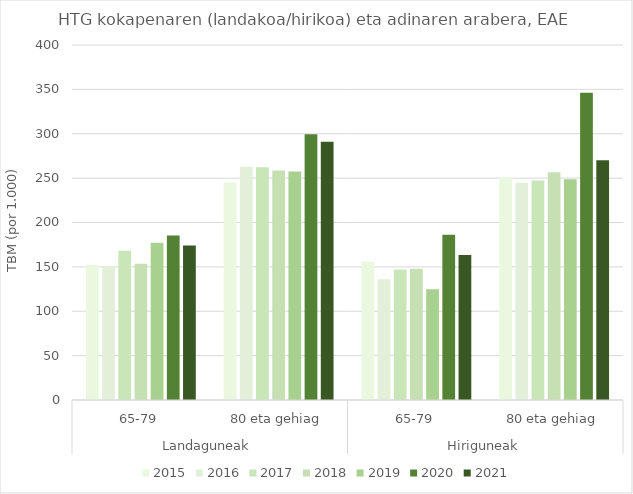
| Category | 2015 | 2016 | 2017 | 2018 | 2019 | 2020 | 2021 |
|---|---|---|---|---|---|---|---|
| 0 | 152.254 | 150.41 | 168.198 | 153.421 | 177.32 | 185.339 | 173.955 |
| 1 | 245.138 | 262.932 | 262.253 | 258.689 | 257.457 | 299.342 | 290.975 |
| 2 | 155.64 | 135.977 | 146.905 | 147.951 | 124.841 | 186.218 | 163.294 |
| 3 | 250.571 | 244.845 | 247.436 | 256.727 | 248.779 | 346.261 | 270.214 |